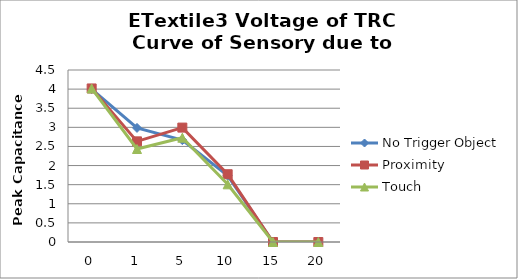
| Category | No Trigger Object | Proximity | Touch |
|---|---|---|---|
| 0.0 | 4.001 | 4.017 | 4.017 |
| 1.0 | 2.985 | 2.633 | 2.433 |
| 5.0 | 2.665 | 2.993 | 2.729 |
| 10.0 | 1.737 | 1.773 | 1.509 |
| 15.0 | 0 | 0 | 0 |
| 20.0 | 0 | 0 | 0 |